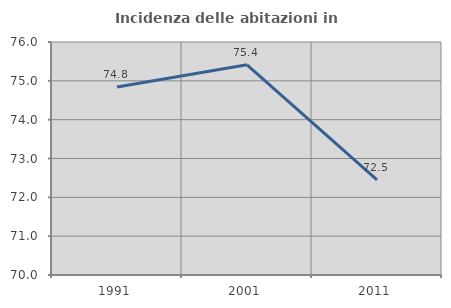
| Category | Incidenza delle abitazioni in proprietà  |
|---|---|
| 1991.0 | 74.843 |
| 2001.0 | 75.414 |
| 2011.0 | 72.451 |